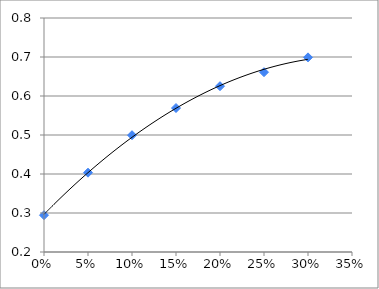
| Category | Series 0 |
|---|---|
| 0.0 | 0.294 |
| 0.05 | 0.403 |
| 0.1 | 0.499 |
| 0.15 | 0.569 |
| 0.2 | 0.625 |
| 0.25 | 0.661 |
| 0.3 | 0.699 |